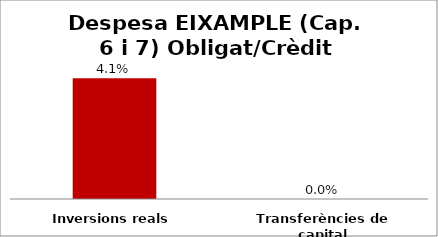
| Category | Series 0 |
|---|---|
| Inversions reals | 0.041 |
| Transferències de capital | 0 |